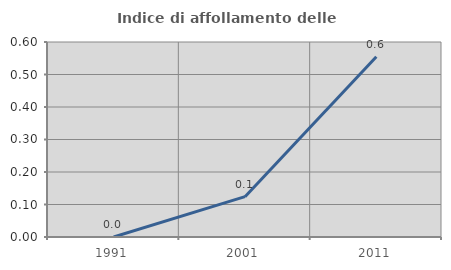
| Category | Indice di affollamento delle abitazioni  |
|---|---|
| 1991.0 | 0 |
| 2001.0 | 0.124 |
| 2011.0 | 0.554 |